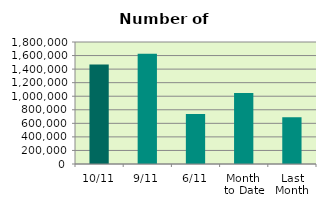
| Category | Series 0 |
|---|---|
| 10/11 | 1466854 |
| 9/11 | 1628298 |
| 6/11 | 738490 |
| Month 
to Date | 1046055.714 |
| Last
Month | 689792.182 |